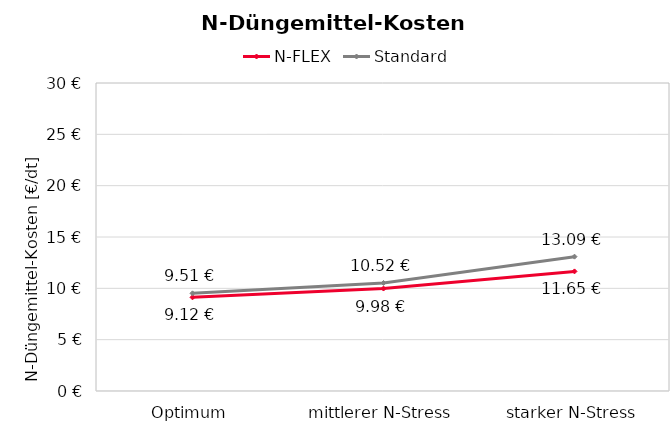
| Category | N-FLEX | Standard |
|---|---|---|
| Optimum | 9.121 | 9.514 |
| mittlerer N-Stress | 9.98 | 10.524 |
| starker N-Stress | 11.649 | 13.086 |